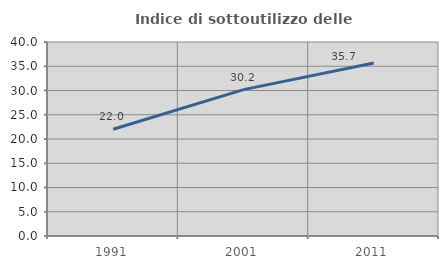
| Category | Indice di sottoutilizzo delle abitazioni  |
|---|---|
| 1991.0 | 22.002 |
| 2001.0 | 30.182 |
| 2011.0 | 35.655 |